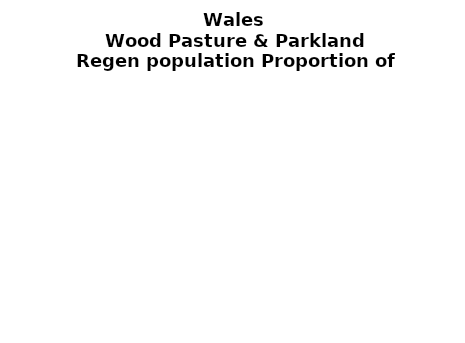
| Category | Wood Pasture & Parkland |
|---|---|
| None | 0.337 |
| Seedlings only | 0 |
| Seedlings, saplings only | 0 |
| Seedlings, saplings, <7 cm trees | 0.047 |
| Saplings only | 0 |
| <7 cm trees, seedlings only | 0 |
| <7 cm trees, saplings only | 0.337 |
| <7 cm Trees only | 0.278 |